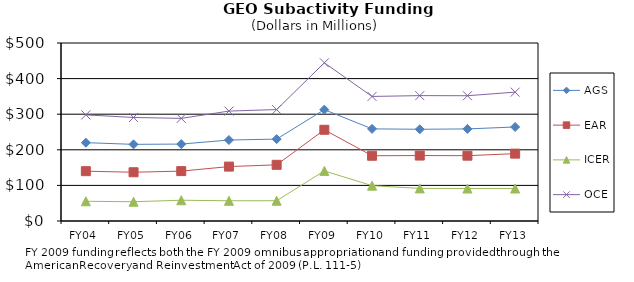
| Category | AGS | EAR | ICER | OCE |
|---|---|---|---|---|
| FY04 | 220.04 | 139.93 | 55.37 | 298.06 |
| FY05 | 215.32 | 136.95 | 54.11 | 290.79 |
| FY06 | 216.09 | 140.12 | 58.37 | 288.25 |
| FY07 | 227.44 | 152.83 | 56.82 | 308.76 |
| FY08 | 230.03 | 157.82 | 56.96 | 313.06 |
| FY09 | 312.8 | 256.22 | 140.75 | 444.36 |
| FY10 | 258.8 | 183.26 | 99.27 | 349.88 |
| FY11 | 257.654 | 183.834 | 91.619 | 352.213 |
| FY12 | 258.66 | 183.5 | 91.21 | 351.9 |
| FY13 | 264.06 | 189.2 | 91.21 | 361.97 |